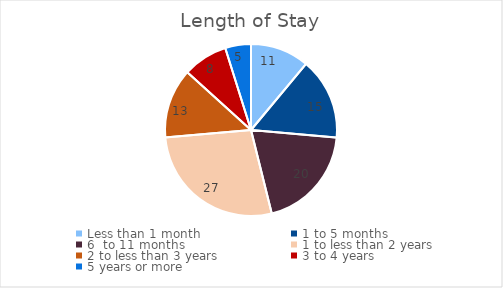
| Category | Series 0 |
|---|---|
| Less than 1 month | 11.056 |
| 1 to 5 months | 15.348 |
| 6  to 11 months | 19.712 |
| 1 to less than 2 years | 27.488 |
| 2 to less than 3 years | 13.109 |
| 3 to 4 years | 8.441 |
| 5 years or more | 4.846 |